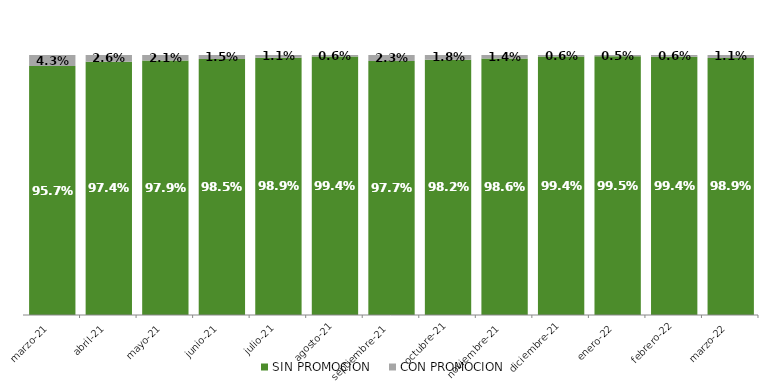
| Category | SIN PROMOCION   | CON PROMOCION   |
|---|---|---|
| 2021-03-01 | 0.957 | 0.043 |
| 2021-04-01 | 0.974 | 0.026 |
| 2021-05-01 | 0.979 | 0.021 |
| 2021-06-01 | 0.985 | 0.015 |
| 2021-07-01 | 0.989 | 0.011 |
| 2021-08-01 | 0.994 | 0.006 |
| 2021-09-01 | 0.977 | 0.023 |
| 2021-10-01 | 0.982 | 0.018 |
| 2021-11-01 | 0.986 | 0.014 |
| 2021-12-01 | 0.994 | 0.006 |
| 2022-01-01 | 0.995 | 0.005 |
| 2022-02-01 | 0.994 | 0.006 |
| 2022-03-01 | 0.989 | 0.011 |